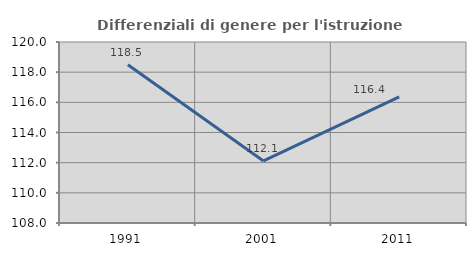
| Category | Differenziali di genere per l'istruzione superiore |
|---|---|
| 1991.0 | 118.486 |
| 2001.0 | 112.115 |
| 2011.0 | 116.355 |